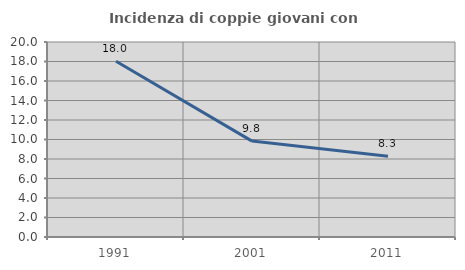
| Category | Incidenza di coppie giovani con figli |
|---|---|
| 1991.0 | 18.018 |
| 2001.0 | 9.836 |
| 2011.0 | 8.28 |